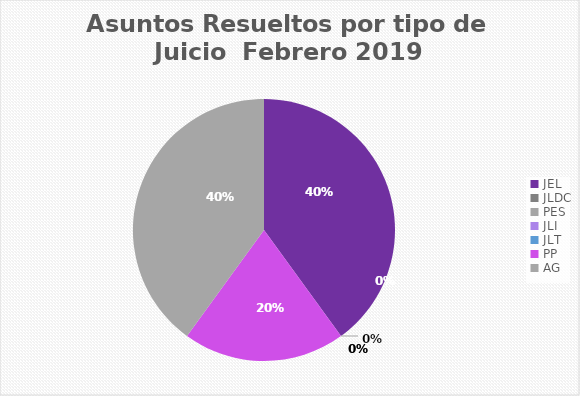
| Category | Asuntos Resueltos por tipo de Juicio  FEBRERO |
|---|---|
| JEL | 2 |
| JLDC | 0 |
| PES | 0 |
| JLI | 0 |
| JLT | 0 |
| PP | 1 |
| AG | 2 |